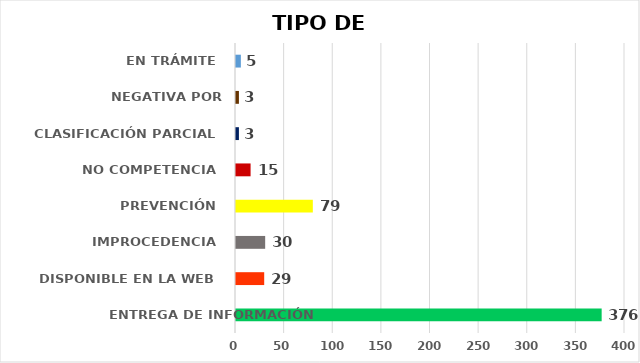
| Category | CANTIDAD DE RESPUESTAS |
|---|---|
| ENTREGA DE INFORMACIÓN | 376 |
| DISPONIBLE EN LA WEB | 29 |
| IMPROCEDENCIA | 30 |
| PREVENCIÓN | 79 |
| NO COMPETENCIA | 15 |
| CLASIFICACIÓN PARCIAL | 3 |
| NEGATIVA POR CLASIFICACIÓN | 3 |
| EN TRÁMITE | 5 |